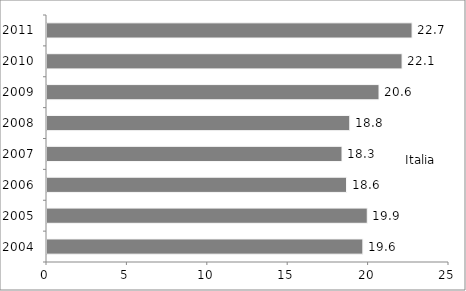
| Category | Series 0 |
|---|---|
| 2004 | 19.642 |
| 2005 | 19.918 |
| 2006 | 18.628 |
| 2007 | 18.346 |
| 2008 | 18.828 |
| 2009 | 20.647 |
| 2010 | 22.081 |
| 2011 | 22.704 |